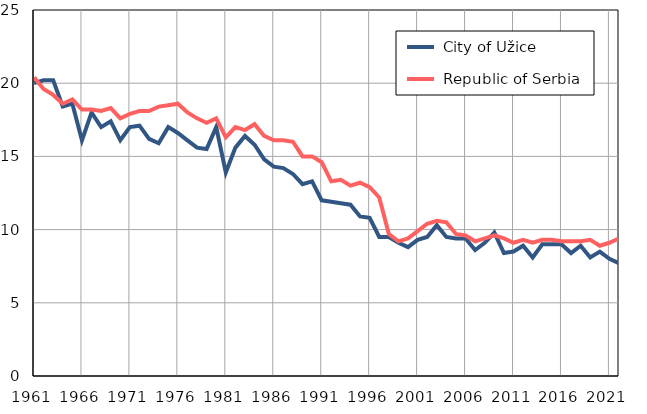
| Category |  City of Užice |  Republic of Serbia |
|---|---|---|
| 1961.0 | 20 | 20.4 |
| 1962.0 | 20.2 | 19.6 |
| 1963.0 | 20.2 | 19.2 |
| 1964.0 | 18.4 | 18.6 |
| 1965.0 | 18.6 | 18.9 |
| 1966.0 | 16.1 | 18.2 |
| 1967.0 | 18 | 18.2 |
| 1968.0 | 17 | 18.1 |
| 1969.0 | 17.4 | 18.3 |
| 1970.0 | 16.1 | 17.6 |
| 1971.0 | 17 | 17.9 |
| 1972.0 | 17.1 | 18.1 |
| 1973.0 | 16.2 | 18.1 |
| 1974.0 | 15.9 | 18.4 |
| 1975.0 | 17 | 18.5 |
| 1976.0 | 16.6 | 18.6 |
| 1977.0 | 16.1 | 18 |
| 1978.0 | 15.6 | 17.6 |
| 1979.0 | 15.5 | 17.3 |
| 1980.0 | 17 | 17.6 |
| 1981.0 | 13.9 | 16.3 |
| 1982.0 | 15.6 | 17 |
| 1983.0 | 16.4 | 16.8 |
| 1984.0 | 15.8 | 17.2 |
| 1985.0 | 14.8 | 16.4 |
| 1986.0 | 14.3 | 16.1 |
| 1987.0 | 14.2 | 16.1 |
| 1988.0 | 13.8 | 16 |
| 1989.0 | 13.1 | 15 |
| 1990.0 | 13.3 | 15 |
| 1991.0 | 12 | 14.6 |
| 1992.0 | 11.9 | 13.3 |
| 1993.0 | 11.8 | 13.4 |
| 1994.0 | 11.7 | 13 |
| 1995.0 | 10.9 | 13.2 |
| 1996.0 | 10.8 | 12.9 |
| 1997.0 | 9.5 | 12.2 |
| 1998.0 | 9.5 | 9.7 |
| 1999.0 | 9.1 | 9.2 |
| 2000.0 | 8.8 | 9.4 |
| 2001.0 | 9.3 | 9.9 |
| 2002.0 | 9.5 | 10.4 |
| 2003.0 | 10.3 | 10.6 |
| 2004.0 | 9.5 | 10.5 |
| 2005.0 | 9.4 | 9.7 |
| 2006.0 | 9.4 | 9.6 |
| 2007.0 | 8.6 | 9.2 |
| 2008.0 | 9.1 | 9.4 |
| 2009.0 | 9.8 | 9.6 |
| 2010.0 | 8.4 | 9.4 |
| 2011.0 | 8.5 | 9.1 |
| 2012.0 | 8.9 | 9.3 |
| 2013.0 | 8.1 | 9.1 |
| 2014.0 | 9 | 9.3 |
| 2015.0 | 9 | 9.3 |
| 2016.0 | 9 | 9.2 |
| 2017.0 | 8.4 | 9.2 |
| 2018.0 | 8.9 | 9.2 |
| 2019.0 | 8.1 | 9.3 |
| 2020.0 | 8.5 | 8.9 |
| 2021.0 | 8 | 9.1 |
| 2022.0 | 7.7 | 9.4 |